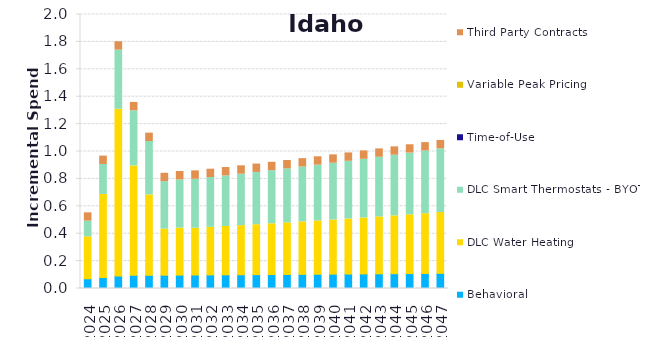
| Category | Behavioral | DLC Water Heating | DLC Smart Thermostats - BYOT | Time-of-Use | Variable Peak Pricing | Third Party Contracts |
|---|---|---|---|---|---|---|
| 2024.0 | 0.071 | 0.306 | 0.114 | 0 | 0 | 0.061 |
| 2025.0 | 0.08 | 0.606 | 0.219 | 0 | 0 | 0.061 |
| 2026.0 | 0.092 | 1.217 | 0.432 | 0 | 0 | 0.061 |
| 2027.0 | 0.096 | 0.798 | 0.402 | 0 | 0 | 0.061 |
| 2028.0 | 0.097 | 0.587 | 0.39 | 0 | 0 | 0.061 |
| 2029.0 | 0.097 | 0.336 | 0.346 | 0 | 0 | 0.061 |
| 2030.0 | 0.098 | 0.343 | 0.353 | 0 | 0 | 0.061 |
| 2031.0 | 0.098 | 0.342 | 0.358 | 0 | 0 | 0.061 |
| 2032.0 | 0.099 | 0.347 | 0.363 | 0 | 0 | 0.061 |
| 2033.0 | 0.1 | 0.353 | 0.369 | 0 | 0 | 0.061 |
| 2034.0 | 0.1 | 0.359 | 0.375 | 0 | 0 | 0.061 |
| 2035.0 | 0.101 | 0.364 | 0.382 | 0 | 0 | 0.061 |
| 2036.0 | 0.102 | 0.37 | 0.388 | 0 | 0 | 0.061 |
| 2037.0 | 0.103 | 0.376 | 0.394 | 0 | 0 | 0.061 |
| 2038.0 | 0.103 | 0.383 | 0.401 | 0 | 0 | 0.061 |
| 2039.0 | 0.104 | 0.389 | 0.408 | 0 | 0 | 0.061 |
| 2040.0 | 0.105 | 0.395 | 0.414 | 0 | 0 | 0.061 |
| 2041.0 | 0.106 | 0.402 | 0.421 | 0 | 0 | 0.061 |
| 2042.0 | 0.106 | 0.408 | 0.428 | 0 | 0 | 0.061 |
| 2043.0 | 0.107 | 0.415 | 0.436 | 0 | 0 | 0.061 |
| 2044.0 | 0.108 | 0.422 | 0.443 | 0 | 0 | 0.061 |
| 2045.0 | 0.109 | 0.429 | 0.45 | 0 | 0 | 0.061 |
| 2046.0 | 0.11 | 0.436 | 0.458 | 0 | 0 | 0.061 |
| 2047.0 | 0.111 | 0.444 | 0.466 | 0 | 0 | 0.061 |